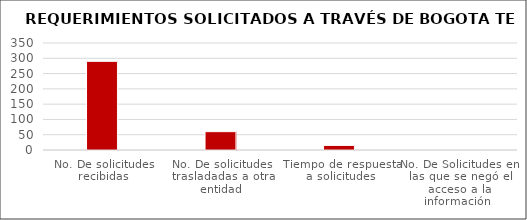
| Category | Series 0 |
|---|---|
| No. De solicitudes recibidas | 290 |
| No. De solicitudes trasladadas a otra entidad | 60 |
| Tiempo de respuesta a solicitudes | 15 |
| No. De Solicitudes en las que se negó el acceso a la información  | 0 |